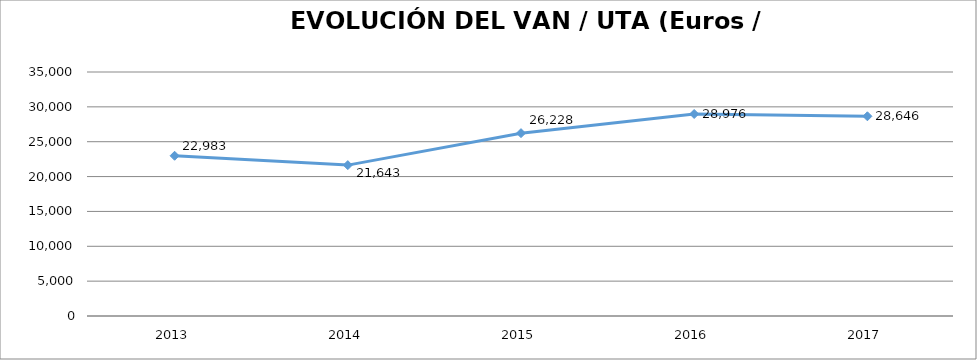
| Category | 2013 |
|---|---|
| 2013.0 | 22982.591 |
| 2014.0 | 21643.401 |
| 2015.0 | 26228.389 |
| 2016.0 | 28975.959 |
| 2017.0 | 28646.454 |